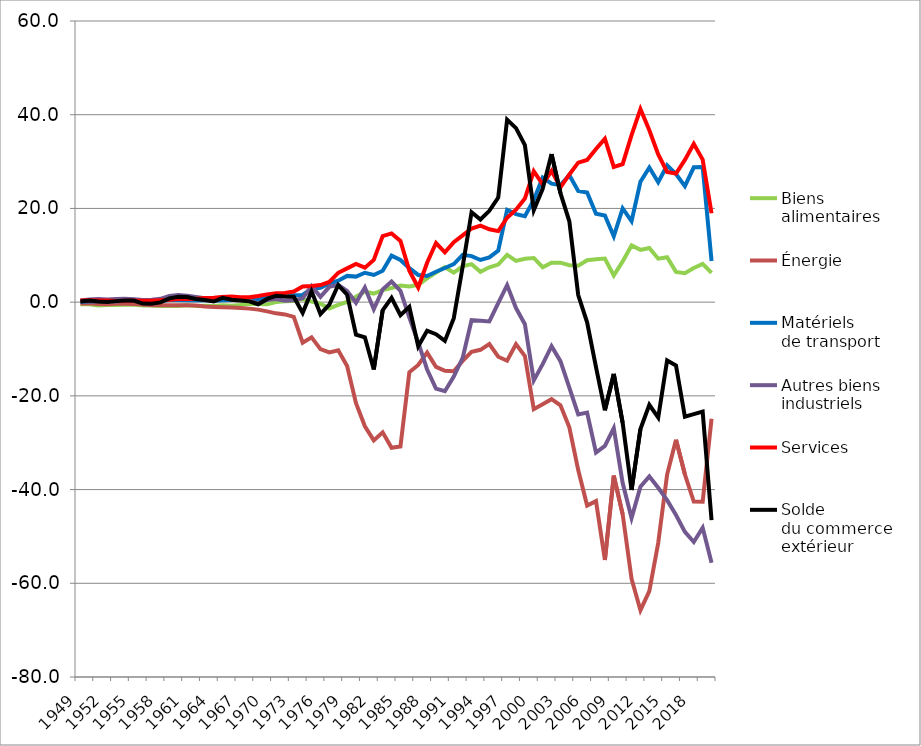
| Category | Biens
alimentaires | Énergie | Matériels
de transport | Autres biens
industriels | Services | Solde
du commerce
extérieur |
|---|---|---|---|---|---|---|
| 1949 | -0.435 | -0.286 | 0.107 | 0.379 | 0.366 | 0.13 |
| 1950 | -0.47 | -0.237 | 0.127 | 0.549 | 0.393 | 0.362 |
| 1951 | -0.696 | -0.388 | 0.19 | 0.649 | 0.364 | 0.119 |
| 1952 | -0.623 | -0.448 | 0.217 | 0.549 | 0.354 | 0.05 |
| 1953 | -0.611 | -0.331 | 0.199 | 0.694 | 0.266 | 0.217 |
| 1954 | -0.555 | -0.353 | 0.231 | 0.697 | 0.314 | 0.335 |
| 1955 | -0.488 | -0.378 | 0.219 | 0.626 | 0.355 | 0.333 |
| 1956 | -0.733 | -0.5 | 0.18 | 0.453 | 0.3 | -0.301 |
| 1957 | -0.729 | -0.672 | 0.228 | 0.523 | 0.311 | -0.34 |
| 1958 | -0.807 | -0.641 | 0.303 | 0.713 | 0.382 | -0.05 |
| 1959 | -0.798 | -0.646 | 0.449 | 1.314 | 0.494 | 0.812 |
| 1960 | -0.813 | -0.658 | 0.431 | 1.504 | 0.676 | 1.14 |
| 1961 | -0.658 | -0.681 | 0.402 | 1.347 | 0.68 | 1.089 |
| 1962 | -0.805 | -0.726 | 0.393 | 1.123 | 0.705 | 0.691 |
| 1963 | -0.766 | -0.949 | 0.435 | 0.833 | 0.891 | 0.444 |
| 1964 | -0.826 | -1.038 | 0.324 | 0.753 | 0.915 | 0.129 |
| 1965 | -0.654 | -1.088 | 0.411 | 1.145 | 1.091 | 0.906 |
| 1966 | -0.744 | -1.13 | 0.454 | 0.739 | 1.181 | 0.5 |
| 1967 | -0.596 | -1.262 | 0.484 | 0.655 | 1.052 | 0.333 |
| 1968 | -0.372 | -1.383 | 0.451 | 0.427 | 1.039 | 0.163 |
| 1969 | -0.416 | -1.598 | 0.564 | -0.304 | 1.306 | -0.448 |
| 1970 | -0.454 | -1.965 | 0.977 | 0.468 | 1.658 | 0.683 |
| 1971 | 0.018 | -2.388 | 1.138 | 0.676 | 1.894 | 1.338 |
| 1972 | 0.207 | -2.622 | 1.357 | 0.325 | 1.948 | 1.214 |
| 1973 | 0.224 | -3.153 | 1.454 | 0.379 | 2.253 | 1.155 |
| 1974 | 0.658 | -8.647 | 1.531 | 0.82 | 3.346 | -2.292 |
| 1975 | 0.103 | -7.511 | 2.852 | 3.429 | 3.427 | 2.299 |
| 1976 | -0.316 | -10.039 | 3.043 | 1.133 | 3.645 | -2.533 |
| 1977 | -1.346 | -10.725 | 3.984 | 3.271 | 4.298 | -0.518 |
| 1978 | -0.604 | -10.287 | 4.585 | 3.693 | 6.263 | 3.65 |
| 1979 | 0.045 | -13.639 | 5.604 | 2.367 | 7.208 | 1.586 |
| 1980 | 1.18 | -21.57 | 5.449 | -0.143 | 8.137 | -6.947 |
| 1981 | 2.261 | -26.5 | 6.267 | 3.117 | 7.352 | -7.503 |
| 1982 | 1.833 | -29.51 | 5.792 | -1.51 | 9.009 | -14.386 |
| 1983 | 2.564 | -27.784 | 6.685 | 2.711 | 14.086 | -1.738 |
| 1984 | 3.003 | -31.082 | 9.908 | 4.406 | 14.677 | 0.913 |
| 1985 | 3.549 | -30.828 | 8.994 | 2.427 | 13.071 | -2.788 |
| 1986 | 3.323 | -14.968 | 7.246 | -3.302 | 6.715 | -0.986 |
| 1987 | 3.671 | -13.406 | 5.801 | -8.583 | 3.117 | -9.4 |
| 1988 | 5.059 | -10.78 | 5.585 | -14.371 | 8.412 | -6.095 |
| 1989 | 6.318 | -13.801 | 6.488 | -18.461 | 12.62 | -6.835 |
| 1990 | 7.462 | -14.649 | 7.289 | -19.007 | 10.64 | -8.265 |
| 1991 | 6.295 | -14.747 | 8.13 | -15.903 | 12.798 | -3.427 |
| 1992 | 7.659 | -12.538 | 10.095 | -11.906 | 14.262 | 7.572 |
| 1993 | 8.112 | -10.6 | 9.825 | -3.86 | 15.711 | 19.188 |
| 1994 | 6.473 | -10.174 | 8.997 | -3.987 | 16.323 | 17.632 |
| 1995 | 7.443 | -8.941 | 9.56 | -4.115 | 15.542 | 19.489 |
| 1996 | 8.016 | -11.654 | 10.998 | -0.2 | 15.154 | 22.315 |
| 1997 | 10.089 | -12.507 | 19.71 | 3.638 | 18.021 | 38.95 |
| 1998 | 8.808 | -8.958 | 18.794 | -1.259 | 19.741 | 37.126 |
| 1999 | 9.269 | -11.49 | 18.347 | -4.706 | 22.092 | 33.513 |
| 2000 | 9.426 | -22.848 | 21.821 | -16.689 | 27.936 | 19.646 |
| 2001 | 7.459 | -21.773 | 26.585 | -13.225 | 25.141 | 24.187 |
| 2002 | 8.401 | -20.704 | 25.286 | -9.402 | 28.019 | 31.599 |
| 2003 | 8.423 | -22.027 | 24.969 | -12.587 | 24.475 | 23.254 |
| 2004 | 7.883 | -26.724 | 27.08 | -18.235 | 27.253 | 17.257 |
| 2005 | 7.793 | -35.833 | 23.725 | -23.948 | 29.772 | 1.509 |
| 2006 | 8.93 | -43.4 | 23.391 | -23.575 | 30.342 | -4.312 |
| 2007 | 9.146 | -42.462 | 18.875 | -32.105 | 32.68 | -13.866 |
| 2008 | 9.29 | -55.036 | 18.474 | -30.686 | 34.879 | -23.078 |
| 2009 | 5.687 | -37.019 | 14.042 | -26.884 | 28.849 | -15.325 |
| 2010 | 8.696 | -45.285 | 20.007 | -38.622 | 29.44 | -25.764 |
| 2011 | 12.087 | -59.028 | 17.278 | -46.066 | 35.633 | -40.096 |
| 2012 | 11.15 | -65.747 | 25.691 | -39.369 | 41.205 | -27.071 |
| 2013 | 11.569 | -61.668 | 28.734 | -37.206 | 36.667 | -21.904 |
| 2014 | 9.272 | -51.37 | 25.58 | -39.61 | 31.504 | -24.624 |
| 2015 | 9.592 | -36.787 | 29.218 | -42.269 | 27.793 | -12.453 |
| 2016 | 6.461 | -29.343 | 27.352 | -45.443 | 27.455 | -13.518 |
| 2017 | 6.195 | -36.75 | 24.769 | -49.023 | 30.353 | -24.456 |
| 2018 | 7.305 | -42.573 | 28.774 | -51.192 | 33.802 | -23.884 |
| 2019 | 8.164 | -42.597 | 28.81 | -48.138 | 30.424 | -23.337 |
| 2020 | 6.236 | -24.9 | 8.783 | -55.602 | 18.962 | -46.521 |